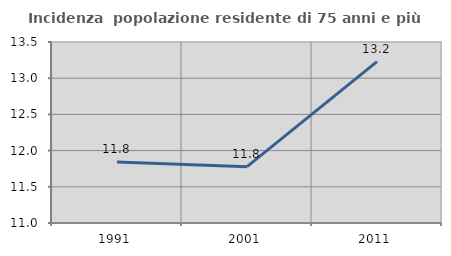
| Category | Incidenza  popolazione residente di 75 anni e più |
|---|---|
| 1991.0 | 11.844 |
| 2001.0 | 11.778 |
| 2011.0 | 13.229 |